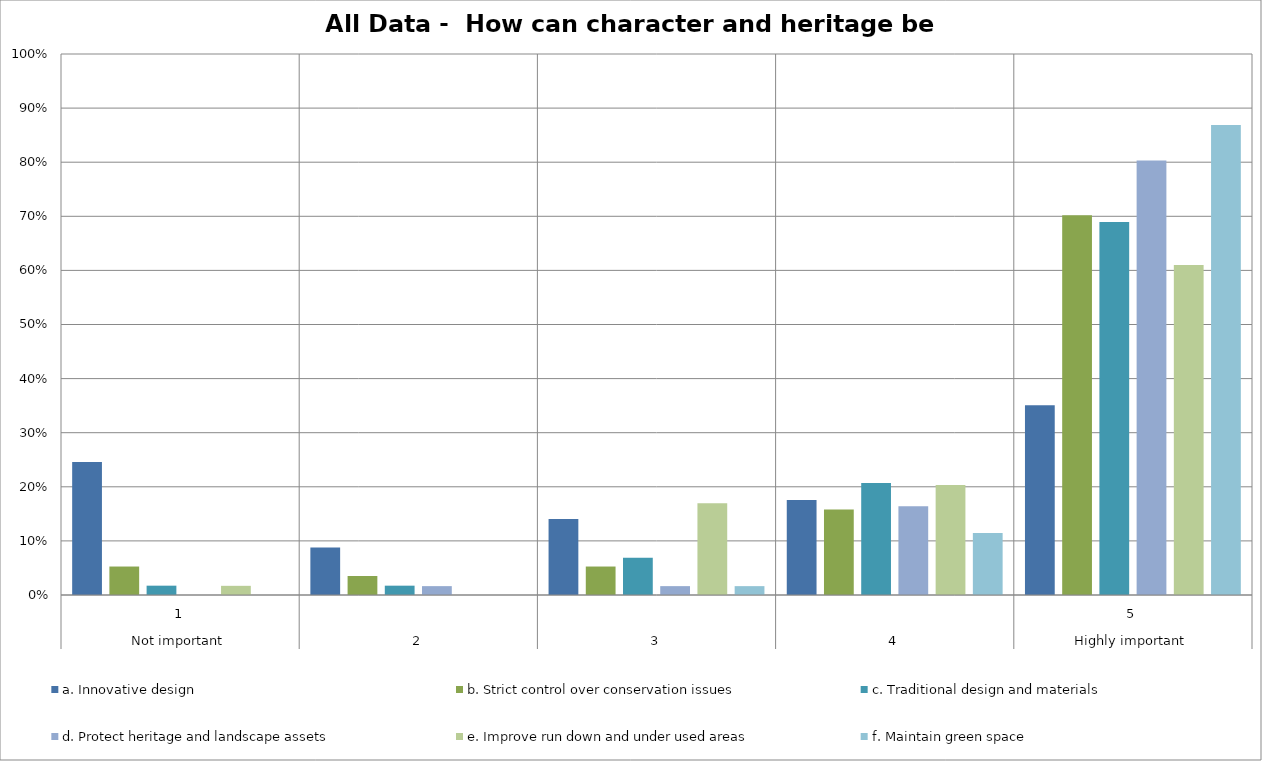
| Category | a. Innovative design | b. Strict control over conservation issues | c. Traditional design and materials | d. Protect heritage and landscape assets | e. Improve run down and under used areas | f. Maintain green space |
|---|---|---|---|---|---|---|
| 0 | 0.246 | 0.053 | 0.017 | 0 | 0.017 | 0 |
| 1 | 0.088 | 0.035 | 0.017 | 0.016 | 0 | 0 |
| 2 | 0.14 | 0.053 | 0.069 | 0.016 | 0.169 | 0.016 |
| 3 | 0.175 | 0.158 | 0.207 | 0.164 | 0.203 | 0.115 |
| 4 | 0.351 | 0.702 | 0.69 | 0.803 | 0.61 | 0.869 |